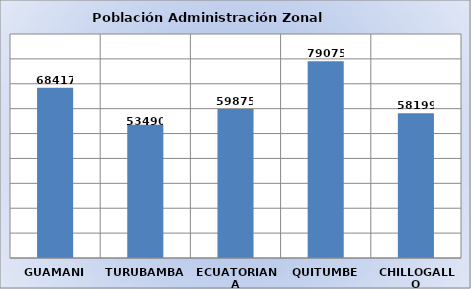
| Category | Series 0 |
|---|---|
| GUAMANI | 68417 |
| TURUBAMBA | 53490 |
| ECUATORIANA | 59875 |
| QUITUMBE | 79075 |
| CHILLOGALLO | 58199 |